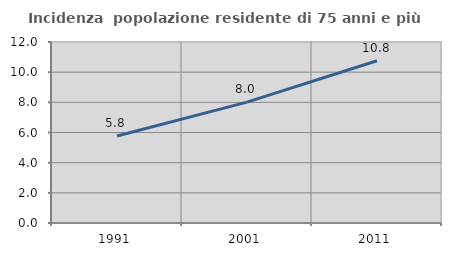
| Category | Incidenza  popolazione residente di 75 anni e più |
|---|---|
| 1991.0 | 5.767 |
| 2001.0 | 8.016 |
| 2011.0 | 10.755 |